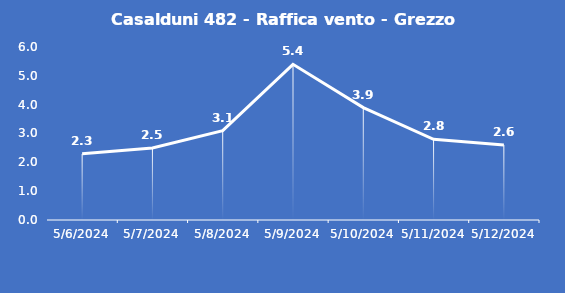
| Category | Casalduni 482 - Raffica vento - Grezzo (m/s) |
|---|---|
| 5/6/24 | 2.3 |
| 5/7/24 | 2.5 |
| 5/8/24 | 3.1 |
| 5/9/24 | 5.4 |
| 5/10/24 | 3.9 |
| 5/11/24 | 2.8 |
| 5/12/24 | 2.6 |